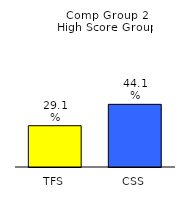
| Category | Series 0 |
|---|---|
| TFS | 0.291 |
| CSS | 0.441 |